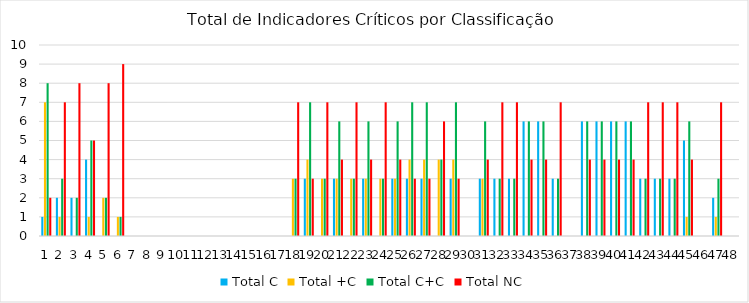
| Category | Total C | Total +C | Total C+C | Total NC |
|---|---|---|---|---|
| 0 | 1 | 7 | 8 | 2 |
| 1 | 2 | 1 | 3 | 7 |
| 2 | 2 | 0 | 2 | 8 |
| 3 | 4 | 1 | 5 | 5 |
| 4 | 0 | 2 | 2 | 8 |
| 5 | 0 | 1 | 1 | 9 |
| 6 | 0 | 0 | 0 | 0 |
| 7 | 0 | 0 | 0 | 0 |
| 8 | 0 | 0 | 0 | 0 |
| 9 | 0 | 0 | 0 | 0 |
| 10 | 0 | 0 | 0 | 0 |
| 11 | 0 | 0 | 0 | 0 |
| 12 | 0 | 0 | 0 | 0 |
| 13 | 0 | 0 | 0 | 0 |
| 14 | 0 | 0 | 0 | 0 |
| 15 | 0 | 0 | 0 | 0 |
| 16 | 0 | 0 | 0 | 0 |
| 17 | 0 | 3 | 3 | 7 |
| 18 | 3 | 4 | 7 | 3 |
| 19 | 0 | 3 | 3 | 7 |
| 20 | 3 | 3 | 6 | 4 |
| 21 | 0 | 3 | 3 | 7 |
| 22 | 3 | 3 | 6 | 4 |
| 23 | 0 | 3 | 3 | 7 |
| 24 | 3 | 3 | 6 | 4 |
| 25 | 3 | 4 | 7 | 3 |
| 26 | 3 | 4 | 7 | 3 |
| 27 | 0 | 4 | 4 | 6 |
| 28 | 3 | 4 | 7 | 3 |
| 29 | 0 | 0 | 0 | 0 |
| 30 | 3 | 3 | 6 | 4 |
| 31 | 3 | 0 | 3 | 7 |
| 32 | 3 | 0 | 3 | 7 |
| 33 | 6 | 0 | 6 | 4 |
| 34 | 6 | 0 | 6 | 4 |
| 35 | 3 | 0 | 3 | 7 |
| 36 | 0 | 0 | 0 | 0 |
| 37 | 6 | 0 | 6 | 4 |
| 38 | 6 | 0 | 6 | 4 |
| 39 | 6 | 0 | 6 | 4 |
| 40 | 6 | 0 | 6 | 4 |
| 41 | 3 | 0 | 3 | 7 |
| 42 | 3 | 0 | 3 | 7 |
| 43 | 3 | 0 | 3 | 7 |
| 44 | 5 | 1 | 6 | 4 |
| 45 | 0 | 0 | 0 | 0 |
| 46 | 2 | 1 | 3 | 7 |
| 47 | 0 | 0 | 0 | 0 |